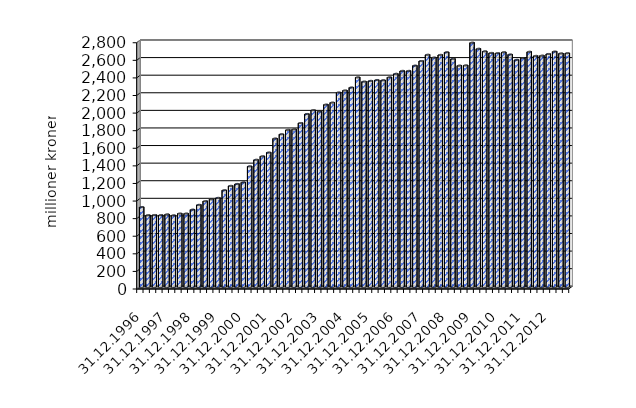
| Category | Series 0 |
|---|---|
| 31.12.1996 | 908.416 |
| 31.03.1997 | 816.888 |
| 30.06.1997 | 819.107 |
| 30.09.1997 | 817.552 |
| 31.12.1997 | 825.968 |
| 31.03.1998 | 814.897 |
| 30.06.1998 | 835.22 |
| 30.09.1998 | 835.281 |
| 31.12.1998 | 879.596 |
| 31.03.1999 | 934.62 |
| 30.06.1999 | 976.412 |
| 30.09.1999 | 997.754 |
| 31.12.1999 | 1013.598 |
| 31.03.2000 | 1100.701 |
| 30.06.2000 | 1150.3 |
| 30.09.2000 | 1172.025 |
| 31.12.2000 | 1189.651 |
| 31.03.2001 | 1372.393 |
| 30.06.2001 | 1446.885 |
| 30.09.2001 | 1486.566 |
| 31.12.2001 | 1529.197 |
| 31.03.2002 | 1688.425 |
| 30.06.2002 | 1737.205 |
| 30.09.2002 | 1786.525 |
| 31.12.2002 | 1793.289 |
| 31.03.2003 | 1864.766 |
| 30.06.2003 | 1967.535 |
| 30.09.2003 | 2010.838 |
| 31.12.2003 | 1995.419 |
| 31.03.2004 | 2074.018 |
| 30.06.2004 | 2097.095 |
| 30.09.2004 | 2212.138 |
| 31.12.2004 | 2235.082 |
| 31.03.2005 | 2268.67 |
| 30.06.2005 | 2384.125 |
| 30.09.2005 | 2335.849 |
| 31.12.2005 | 2343.776 |
| 31.03.2006 | 2353.286 |
| 30.06.2006 | 2351.281 |
| 30.09.2006 | 2384.618 |
| 31.12.2006 | 2424.277 |
| 31.03.2007 | 2457.666 |
| 30.06.2007 | 2457.37 |
| 30.09.2007 | 2517.064 |
| 31.12.2007 | 2569.962 |
| 31.03.2008 | 2640.759 |
| 30.06.2008 | 2609.016 |
| 30.09.2008 | 2639.404 |
| 31.12.2008 | 2669.518 |
| 31.03.2009 | 2594.419 |
| 30.06.2009 | 2517.3 |
| 30.09.2009 | 2520.265 |
| 31.12.2009 | 2778.162 |
| 31.03.2010 | 2708.956 |
| 30.06.2010 | 2680.032 |
| 30.09.2010 | 2661.718 |
| 31.12.2010 | 2658.994 |
| 31.03.2011 | 2670.097 |
| 30.06.2011 | 2643.777 |
| 30.09.2011 | 2582.864 |
| 31.12.2011 | 2603.653 |
| 31.03.2012 | 2674.662 |
| 30.06.2012 | 2627.864 |
| 30.09.2012 | 2630.833 |
| 31.12.2012 | 2649.814 |
| 31.03.2013 | 2676.984 |
| 30.06.2013 | 2656.134 |
| 30.09.2013 | 2658.696 |